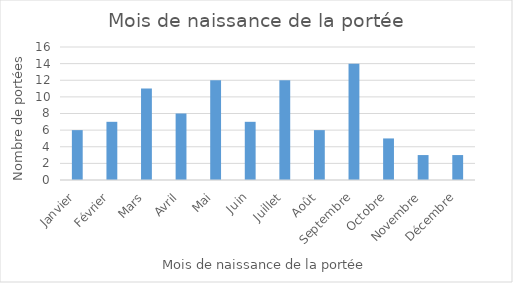
| Category | Series 0 |
|---|---|
| Janvier | 6 |
| Février | 7 |
| Mars | 11 |
| Avril | 8 |
| Mai | 12 |
| Juin | 7 |
| Juillet | 12 |
| Août | 6 |
| Septembre | 14 |
| Octobre | 5 |
| Novembre | 3 |
| Décembre | 3 |